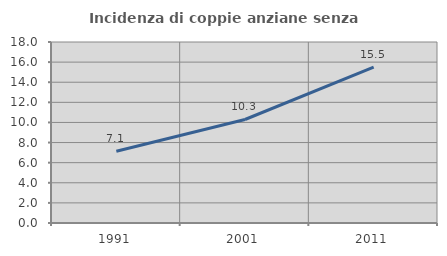
| Category | Incidenza di coppie anziane senza figli  |
|---|---|
| 1991.0 | 7.143 |
| 2001.0 | 10.294 |
| 2011.0 | 15.504 |